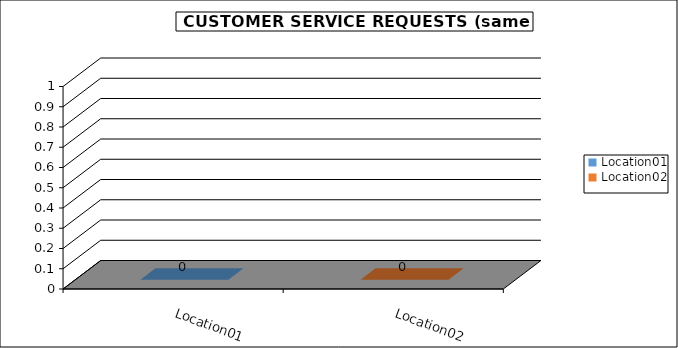
| Category | Series 0 |
|---|---|
| Location01 | 0 |
| Location02 | 0 |